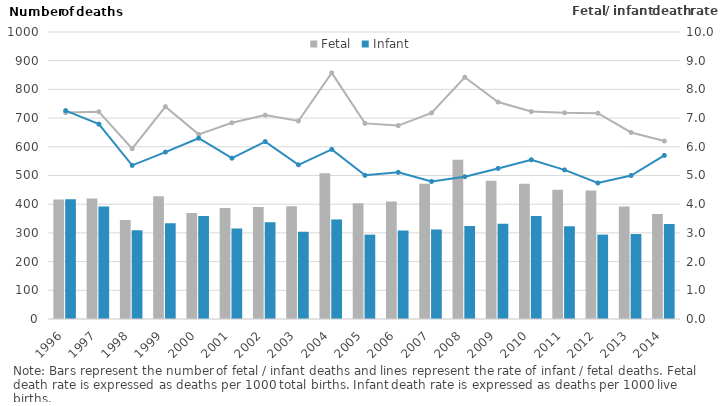
| Category | Fetal | Infant |
|---|---|---|
| 1996.0 | 416 | 417 |
| 1997.0 | 420 | 392 |
| 1998.0 | 345 | 309 |
| 1999.0 | 428 | 334 |
| 2000.0 | 369 | 359 |
| 2001.0 | 387 | 315 |
| 2002.0 | 390 | 337 |
| 2003.0 | 393 | 304 |
| 2004.0 | 508 | 347 |
| 2005.0 | 403 | 294 |
| 2006.0 | 409 | 308 |
| 2007.0 | 471 | 312 |
| 2008.0 | 555 | 324 |
| 2009.0 | 482 | 332 |
| 2010.0 | 471 | 359 |
| 2011.0 | 450 | 323 |
| 2012.0 | 448 | 294 |
| 2013.0 | 392 | 296 |
| 2014.0 | 366 | 331 |